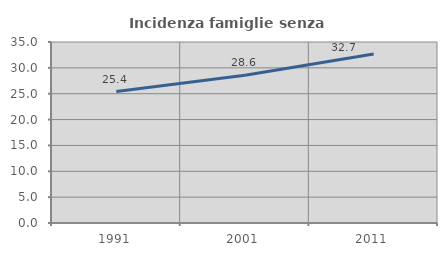
| Category | Incidenza famiglie senza nuclei |
|---|---|
| 1991.0 | 25.424 |
| 2001.0 | 28.558 |
| 2011.0 | 32.662 |